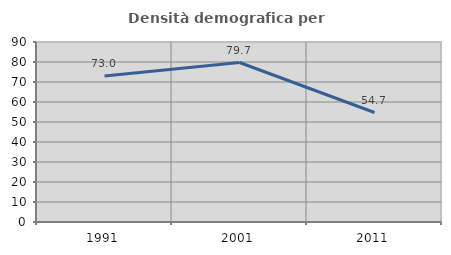
| Category | Densità demografica |
|---|---|
| 1991.0 | 73.011 |
| 2001.0 | 79.738 |
| 2011.0 | 54.741 |